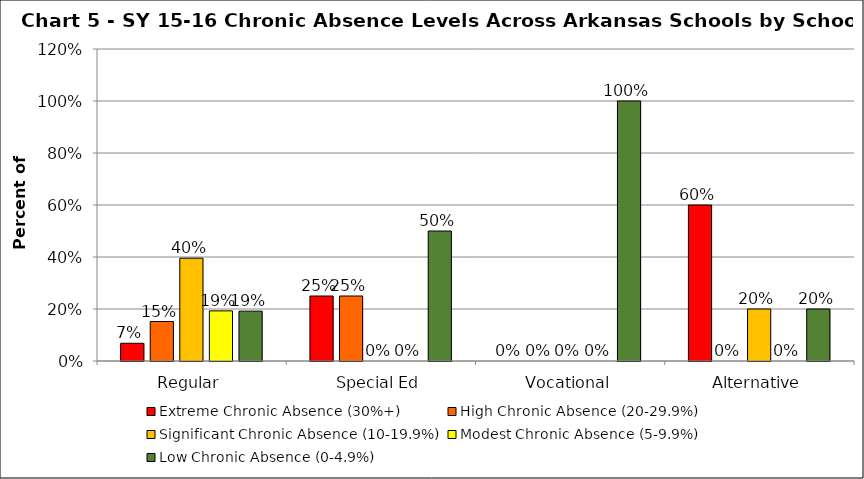
| Category | Extreme Chronic Absence (30%+) | High Chronic Absence (20-29.9%) | Significant Chronic Absence (10-19.9%) | Modest Chronic Absence (5-9.9%) | Low Chronic Absence (0-4.9%) |
|---|---|---|---|---|---|
| 0 | 0.068 | 0.152 | 0.395 | 0.193 | 0.192 |
| 1 | 0.25 | 0.25 | 0 | 0 | 0.5 |
| 2 | 0 | 0 | 0 | 0 | 1 |
| 3 | 0.6 | 0 | 0.2 | 0 | 0.2 |